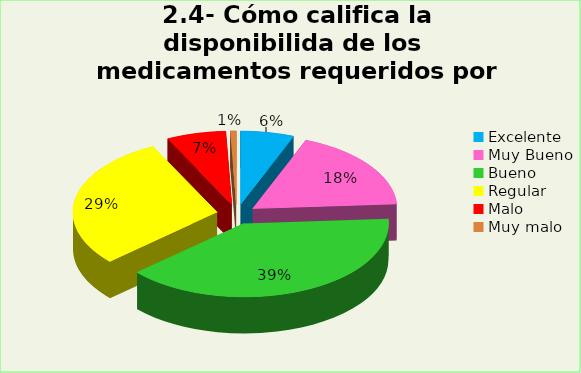
| Category | Series 0 |
|---|---|
| Excelente | 0.06 |
| Muy Bueno | 0.18 |
| Bueno  | 0.393 |
| Regular  | 0.293 |
| Malo  | 0.067 |
| Muy malo  | 0.007 |